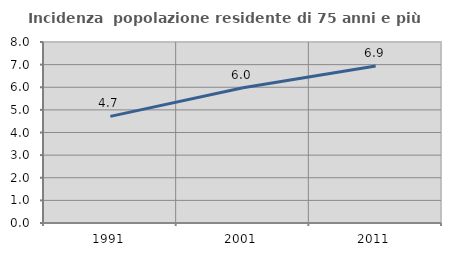
| Category | Incidenza  popolazione residente di 75 anni e più |
|---|---|
| 1991.0 | 4.713 |
| 2001.0 | 5.977 |
| 2011.0 | 6.939 |